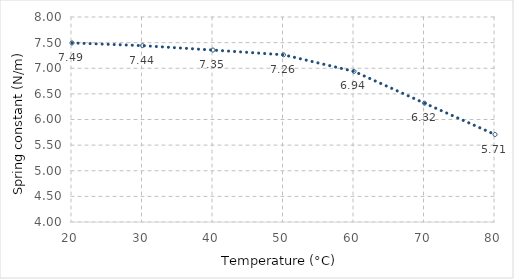
| Category | Spring stiffness (N/m) | Series 1 |
|---|---|---|
| 20.0 | 7.494 |  |
| 30.0 | 7.441 |  |
| 40.0 | 7.355 |  |
| 50.0 | 7.263 |  |
| 60.0 | 6.939 |  |
| 70.0 | 6.318 |  |
| 80.0 | 5.707 |  |